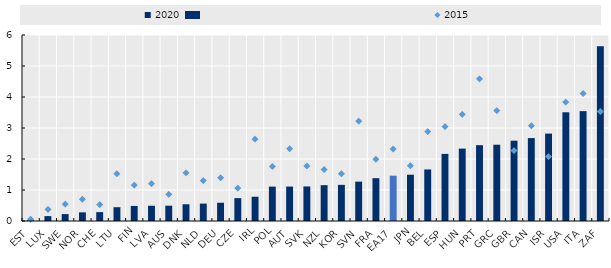
| Category | 2020 |
|---|---|
| EST | 0.027 |
| LUX | 0.158 |
| SWE | 0.223 |
| NOR | 0.279 |
| CHE | 0.287 |
| LTU | 0.445 |
| FIN | 0.485 |
| LVA | 0.493 |
| AUS | 0.494 |
| DNK | 0.54 |
| NLD | 0.561 |
| DEU | 0.589 |
| CZE | 0.737 |
| IRL | 0.782 |
| POL | 1.109 |
| AUT | 1.111 |
| SVK | 1.115 |
| NZL | 1.156 |
| KOR | 1.166 |
| SVN | 1.27 |
| FRA | 1.381 |
| EA17 | 1.462 |
| JPN | 1.493 |
| BEL | 1.662 |
| ESP | 2.165 |
| HUN | 2.335 |
| PRT | 2.446 |
| GRC | 2.461 |
| GBR | 2.591 |
| CAN | 2.675 |
| ISR | 2.82 |
| USA | 3.507 |
| ITA | 3.544 |
| ZAF | 5.635 |